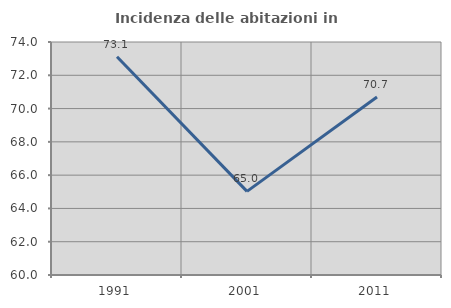
| Category | Incidenza delle abitazioni in proprietà  |
|---|---|
| 1991.0 | 73.112 |
| 2001.0 | 65.026 |
| 2011.0 | 70.698 |